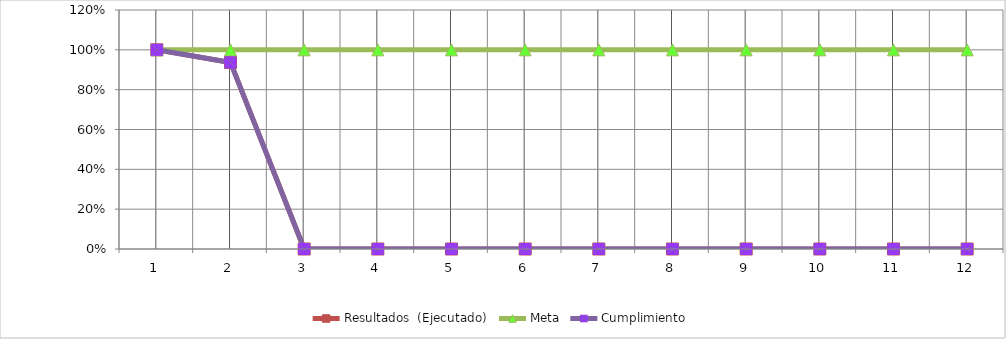
| Category | Resultados  (Ejecutado) | Meta | Cumplimiento |
|---|---|---|---|
| 0 | 1 | 1 | 1 |
| 1 | 0.937 | 1 | 0.937 |
| 2 | 0 | 1 | 0 |
| 3 | 0 | 1 | 0 |
| 4 | 0 | 1 | 0 |
| 5 | 0 | 1 | 0 |
| 6 | 0 | 1 | 0 |
| 7 | 0 | 1 | 0 |
| 8 | 0 | 1 | 0 |
| 9 | 0 | 1 | 0 |
| 10 | 0 | 1 | 0 |
| 11 | 0 | 1 | 0 |